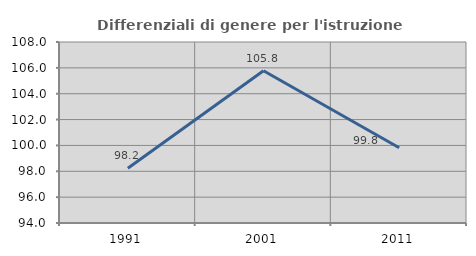
| Category | Differenziali di genere per l'istruzione superiore |
|---|---|
| 1991.0 | 98.237 |
| 2001.0 | 105.772 |
| 2011.0 | 99.823 |